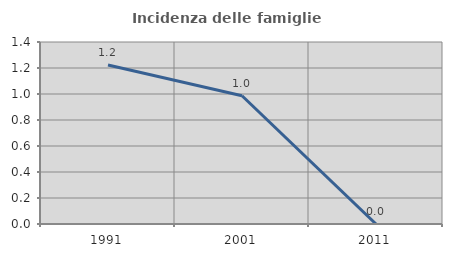
| Category | Incidenza delle famiglie numerose |
|---|---|
| 1991.0 | 1.223 |
| 2001.0 | 0.987 |
| 2011.0 | 0 |